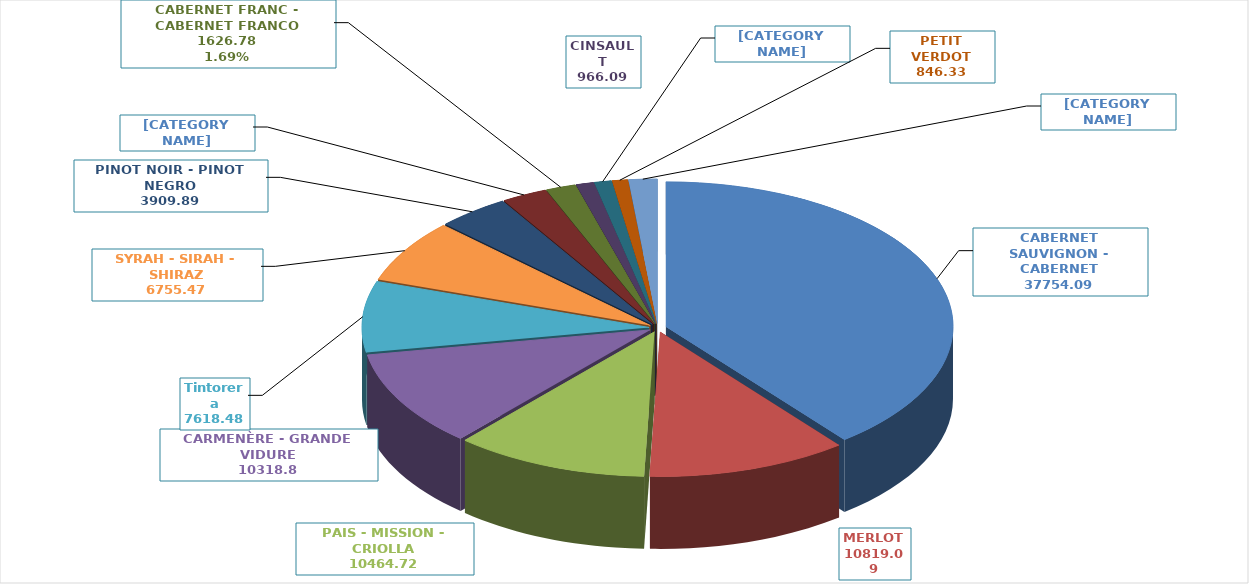
| Category | Series 0 |
|---|---|
| CABERNET SAUVIGNON - CABERNET | 37754.09 |
| MERLOT | 10819.09 |
| PAIS - MISSION - CRIOLLA | 10464.72 |
| CARMENÈRE - GRANDE VIDURE | 10318.8 |
| Tintorera | 7618.48 |
| SYRAH - SIRAH - SHIRAZ | 6755.47 |
| PINOT NOIR - PINOT NEGRO | 3909.89 |
| COT - COT ROUGE - MALBEC - MALBEK - MALBECK | 2468.51 |
| CABERNET FRANC - CABERNET FRANCO | 1626.78 |
| CINSAULT | 966.09 |
| CARIGNAN - CARIGNANE - CARIÑENA | 940.6 |
| PETIT VERDOT | 846.33 |
| OTRAS 43 VARIEDADES | 1543.65 |